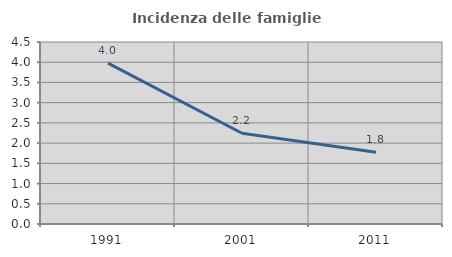
| Category | Incidenza delle famiglie numerose |
|---|---|
| 1991.0 | 3.976 |
| 2001.0 | 2.245 |
| 2011.0 | 1.774 |